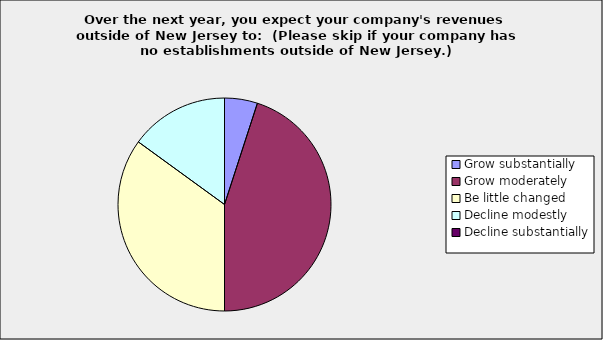
| Category | Series 0 |
|---|---|
| Grow substantially | 0.05 |
| Grow moderately | 0.45 |
| Be little changed | 0.35 |
| Decline modestly | 0.15 |
| Decline substantially | 0 |